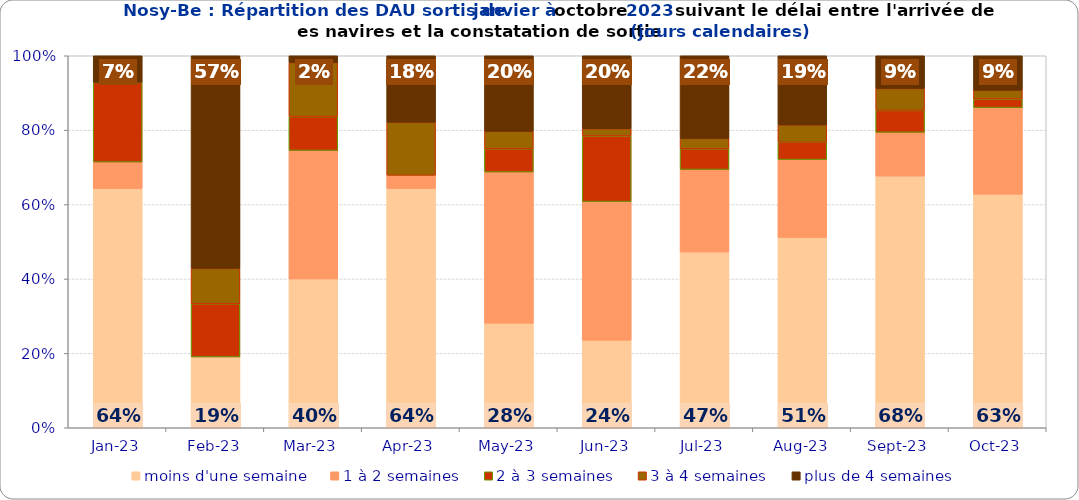
| Category | moins d'une semaine | 1 à 2 semaines | 2 à 3 semaines | 3 à 4 semaines | plus de 4 semaines |
|---|---|---|---|---|---|
| 2023-01-01 | 0.643 | 0.071 | 0.214 | 0 | 0.071 |
| 2023-02-01 | 0.19 | 0 | 0.143 | 0.095 | 0.571 |
| 2023-03-01 | 0.4 | 0.345 | 0.091 | 0.145 | 0.018 |
| 2023-04-01 | 0.643 | 0.036 | 0 | 0.143 | 0.179 |
| 2023-05-01 | 0.281 | 0.406 | 0.062 | 0.047 | 0.203 |
| 2023-06-01 | 0.235 | 0.373 | 0.176 | 0.02 | 0.196 |
| 2023-07-01 | 0.472 | 0.222 | 0.056 | 0.028 | 0.222 |
| 2023-08-01 | 0.512 | 0.209 | 0.047 | 0.047 | 0.186 |
| 2023-09-01 | 0.676 | 0.118 | 0.059 | 0.059 | 0.088 |
| 2023-10-01 | 0.628 | 0.233 | 0.023 | 0.023 | 0.093 |